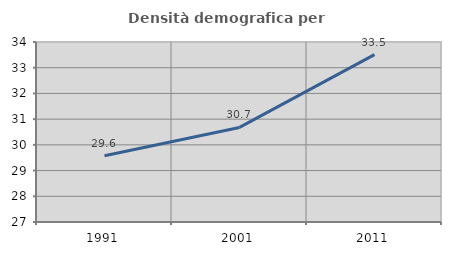
| Category | Densità demografica |
|---|---|
| 1991.0 | 29.576 |
| 2001.0 | 30.677 |
| 2011.0 | 33.509 |